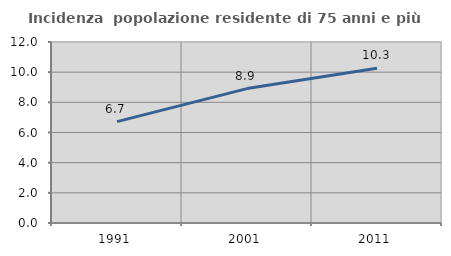
| Category | Incidenza  popolazione residente di 75 anni e più |
|---|---|
| 1991.0 | 6.721 |
| 2001.0 | 8.911 |
| 2011.0 | 10.254 |